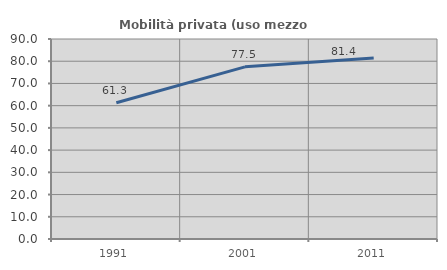
| Category | Mobilità privata (uso mezzo privato) |
|---|---|
| 1991.0 | 61.327 |
| 2001.0 | 77.458 |
| 2011.0 | 81.395 |